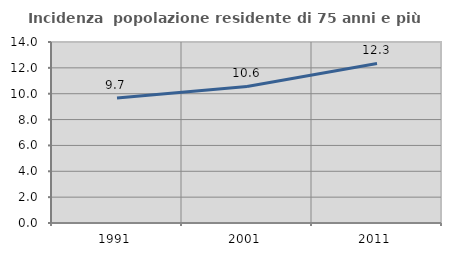
| Category | Incidenza  popolazione residente di 75 anni e più |
|---|---|
| 1991.0 | 9.668 |
| 2001.0 | 10.562 |
| 2011.0 | 12.34 |